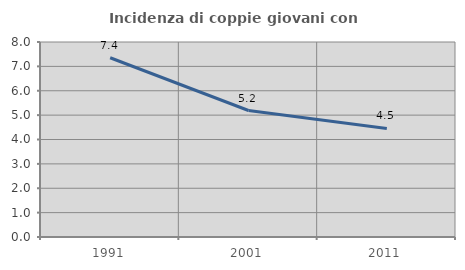
| Category | Incidenza di coppie giovani con figli |
|---|---|
| 1991.0 | 7.353 |
| 2001.0 | 5.189 |
| 2011.0 | 4.455 |